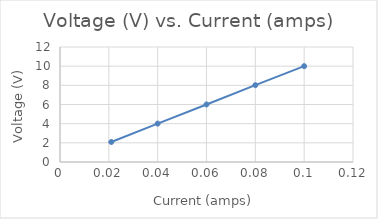
| Category | Voltage (V) |
|---|---|
| 0.021 | 2.089 |
| 0.04 | 4.008 |
| 0.06 | 6.004 |
| 0.08 | 8.02 |
| 0.1 | 10 |